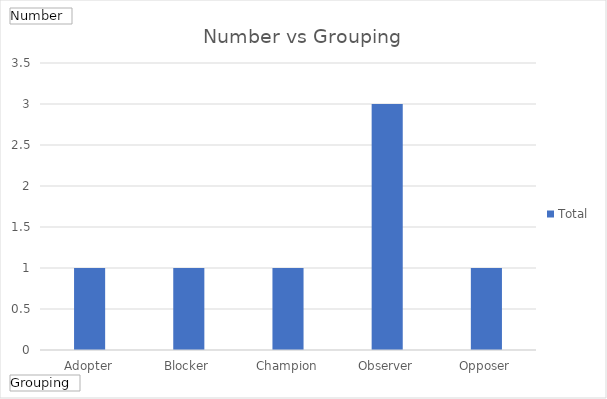
| Category | Total |
|---|---|
| Adopter | 1 |
| Blocker | 1 |
| Champion | 1 |
| Observer | 3 |
| Opposer | 1 |